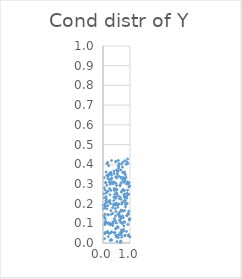
| Category | Series 0 |
|---|---|
| -100.0 | -100 |
| -100.0 | -100 |
| -100.0 | -100 |
| 0.7742711446604577 | 0.107 |
| -100.0 | -100 |
| -100.0 | -100 |
| -100.0 | -100 |
| -100.0 | -100 |
| -100.0 | -100 |
| -100.0 | -100 |
| -100.0 | -100 |
| 0.5765616715410243 | 0.339 |
| -100.0 | -100 |
| -100.0 | -100 |
| -100.0 | -100 |
| -100.0 | -100 |
| -100.0 | -100 |
| -100.0 | -100 |
| -100.0 | -100 |
| -100.0 | -100 |
| -100.0 | -100 |
| 0.25481128692300226 | 0.216 |
| -100.0 | -100 |
| -100.0 | -100 |
| -100.0 | -100 |
| -100.0 | -100 |
| -100.0 | -100 |
| -100.0 | -100 |
| -100.0 | -100 |
| -100.0 | -100 |
| -100.0 | -100 |
| -100.0 | -100 |
| -100.0 | -100 |
| -100.0 | -100 |
| -100.0 | -100 |
| -100.0 | -100 |
| -100.0 | -100 |
| 0.6402166240029006 | 0.052 |
| -100.0 | -100 |
| -100.0 | -100 |
| -100.0 | -100 |
| -100.0 | -100 |
| -100.0 | -100 |
| -100.0 | -100 |
| -100.0 | -100 |
| 0.9499136076958087 | 0.148 |
| -100.0 | -100 |
| -100.0 | -100 |
| -100.0 | -100 |
| -100.0 | -100 |
| -100.0 | -100 |
| -100.0 | -100 |
| -100.0 | -100 |
| -100.0 | -100 |
| -100.0 | -100 |
| 0.7823796118003961 | 0.329 |
| -100.0 | -100 |
| -100.0 | -100 |
| -100.0 | -100 |
| -100.0 | -100 |
| -100.0 | -100 |
| -100.0 | -100 |
| 0.4207167185646359 | 0.124 |
| -100.0 | -100 |
| -100.0 | -100 |
| -100.0 | -100 |
| -100.0 | -100 |
| -100.0 | -100 |
| -100.0 | -100 |
| -100.0 | -100 |
| -100.0 | -100 |
| -100.0 | -100 |
| -100.0 | -100 |
| -100.0 | -100 |
| -100.0 | -100 |
| -100.0 | -100 |
| -100.0 | -100 |
| -100.0 | -100 |
| -100.0 | -100 |
| -100.0 | -100 |
| -100.0 | -100 |
| -100.0 | -100 |
| -100.0 | -100 |
| -100.0 | -100 |
| -100.0 | -100 |
| -100.0 | -100 |
| -100.0 | -100 |
| -100.0 | -100 |
| -100.0 | -100 |
| 0.7235679218305999 | 0.321 |
| -100.0 | -100 |
| 0.5005538349576034 | 0.031 |
| -100.0 | -100 |
| -100.0 | -100 |
| -100.0 | -100 |
| -100.0 | -100 |
| -100.0 | -100 |
| -100.0 | -100 |
| -100.0 | -100 |
| -100.0 | -100 |
| -100.0 | -100 |
| -100.0 | -100 |
| -100.0 | -100 |
| -100.0 | -100 |
| -100.0 | -100 |
| -100.0 | -100 |
| -100.0 | -100 |
| -100.0 | -100 |
| -100.0 | -100 |
| -100.0 | -100 |
| -100.0 | -100 |
| -100.0 | -100 |
| -100.0 | -100 |
| -100.0 | -100 |
| -100.0 | -100 |
| -100.0 | -100 |
| -100.0 | -100 |
| -100.0 | -100 |
| 0.8628502370787773 | 0.399 |
| -100.0 | -100 |
| -100.0 | -100 |
| -100.0 | -100 |
| -100.0 | -100 |
| -100.0 | -100 |
| -100.0 | -100 |
| 0.8003369083146388 | 0.36 |
| 0.4977410522909922 | 0.256 |
| -100.0 | -100 |
| -100.0 | -100 |
| -100.0 | -100 |
| -100.0 | -100 |
| -100.0 | -100 |
| -100.0 | -100 |
| -100.0 | -100 |
| -100.0 | -100 |
| -100.0 | -100 |
| -100.0 | -100 |
| -100.0 | -100 |
| -100.0 | -100 |
| -100.0 | -100 |
| -100.0 | -100 |
| -100.0 | -100 |
| -100.0 | -100 |
| -100.0 | -100 |
| -100.0 | -100 |
| -100.0 | -100 |
| -100.0 | -100 |
| -100.0 | -100 |
| -100.0 | -100 |
| 0.8362634231939766 | 0.198 |
| -100.0 | -100 |
| -100.0 | -100 |
| -100.0 | -100 |
| -100.0 | -100 |
| -100.0 | -100 |
| -100.0 | -100 |
| -100.0 | -100 |
| -100.0 | -100 |
| -100.0 | -100 |
| -100.0 | -100 |
| -100.0 | -100 |
| -100.0 | -100 |
| 0.027762650885497453 | 0.177 |
| -100.0 | -100 |
| -100.0 | -100 |
| -100.0 | -100 |
| -100.0 | -100 |
| -100.0 | -100 |
| -100.0 | -100 |
| -100.0 | -100 |
| -100.0 | -100 |
| -100.0 | -100 |
| -100.0 | -100 |
| -100.0 | -100 |
| -100.0 | -100 |
| -100.0 | -100 |
| -100.0 | -100 |
| -100.0 | -100 |
| -100.0 | -100 |
| -100.0 | -100 |
| -100.0 | -100 |
| -100.0 | -100 |
| -100.0 | -100 |
| -100.0 | -100 |
| -100.0 | -100 |
| -100.0 | -100 |
| -100.0 | -100 |
| -100.0 | -100 |
| -100.0 | -100 |
| -100.0 | -100 |
| -100.0 | -100 |
| -100.0 | -100 |
| -100.0 | -100 |
| -100.0 | -100 |
| -100.0 | -100 |
| -100.0 | -100 |
| -100.0 | -100 |
| -100.0 | -100 |
| -100.0 | -100 |
| -100.0 | -100 |
| -100.0 | -100 |
| -100.0 | -100 |
| -100.0 | -100 |
| -100.0 | -100 |
| -100.0 | -100 |
| -100.0 | -100 |
| -100.0 | -100 |
| -100.0 | -100 |
| -100.0 | -100 |
| -100.0 | -100 |
| -100.0 | -100 |
| -100.0 | -100 |
| -100.0 | -100 |
| -100.0 | -100 |
| -100.0 | -100 |
| -100.0 | -100 |
| -100.0 | -100 |
| -100.0 | -100 |
| -100.0 | -100 |
| -100.0 | -100 |
| -100.0 | -100 |
| -100.0 | -100 |
| -100.0 | -100 |
| -100.0 | -100 |
| -100.0 | -100 |
| -100.0 | -100 |
| 0.1111089341670185 | 0.253 |
| -100.0 | -100 |
| -100.0 | -100 |
| -100.0 | -100 |
| -100.0 | -100 |
| -100.0 | -100 |
| -100.0 | -100 |
| -100.0 | -100 |
| 0.06257710881308665 | 0.177 |
| -100.0 | -100 |
| -100.0 | -100 |
| -100.0 | -100 |
| -100.0 | -100 |
| -100.0 | -100 |
| -100.0 | -100 |
| -100.0 | -100 |
| -100.0 | -100 |
| -100.0 | -100 |
| -100.0 | -100 |
| -100.0 | -100 |
| -100.0 | -100 |
| -100.0 | -100 |
| -100.0 | -100 |
| -100.0 | -100 |
| -100.0 | -100 |
| 0.46705694560583 | 0.137 |
| -100.0 | -100 |
| -100.0 | -100 |
| 0.24112782837990077 | 0.208 |
| -100.0 | -100 |
| -100.0 | -100 |
| -100.0 | -100 |
| -100.0 | -100 |
| 0.498551924813853 | 0.37 |
| -100.0 | -100 |
| -100.0 | -100 |
| -100.0 | -100 |
| -100.0 | -100 |
| -100.0 | -100 |
| -100.0 | -100 |
| -100.0 | -100 |
| 0.27878322207828055 | 0.358 |
| -100.0 | -100 |
| -100.0 | -100 |
| -100.0 | -100 |
| -100.0 | -100 |
| -100.0 | -100 |
| -100.0 | -100 |
| -100.0 | -100 |
| -100.0 | -100 |
| -100.0 | -100 |
| -100.0 | -100 |
| -100.0 | -100 |
| -100.0 | -100 |
| -100.0 | -100 |
| -100.0 | -100 |
| -100.0 | -100 |
| -100.0 | -100 |
| -100.0 | -100 |
| -100.0 | -100 |
| -100.0 | -100 |
| -100.0 | -100 |
| -100.0 | -100 |
| -100.0 | -100 |
| -100.0 | -100 |
| -100.0 | -100 |
| -100.0 | -100 |
| -100.0 | -100 |
| -100.0 | -100 |
| -100.0 | -100 |
| -100.0 | -100 |
| -100.0 | -100 |
| -100.0 | -100 |
| -100.0 | -100 |
| -100.0 | -100 |
| 0.8019658814439082 | 0.249 |
| -100.0 | -100 |
| -100.0 | -100 |
| 0.7419516529665181 | 0.411 |
| -100.0 | -100 |
| -100.0 | -100 |
| -100.0 | -100 |
| -100.0 | -100 |
| -100.0 | -100 |
| -100.0 | -100 |
| -100.0 | -100 |
| -100.0 | -100 |
| 0.6890415489260914 | 0.402 |
| -100.0 | -100 |
| -100.0 | -100 |
| -100.0 | -100 |
| -100.0 | -100 |
| -100.0 | -100 |
| -100.0 | -100 |
| -100.0 | -100 |
| -100.0 | -100 |
| -100.0 | -100 |
| -100.0 | -100 |
| -100.0 | -100 |
| -100.0 | -100 |
| -100.0 | -100 |
| -100.0 | -100 |
| -100.0 | -100 |
| -100.0 | -100 |
| -100.0 | -100 |
| -100.0 | -100 |
| -100.0 | -100 |
| -100.0 | -100 |
| 0.72083535850599 | 0.385 |
| -100.0 | -100 |
| -100.0 | -100 |
| -100.0 | -100 |
| 0.6780203866252439 | 0.005 |
| 0.4769030382822227 | 0.227 |
| -100.0 | -100 |
| -100.0 | -100 |
| -100.0 | -100 |
| -100.0 | -100 |
| -100.0 | -100 |
| -100.0 | -100 |
| -100.0 | -100 |
| -100.0 | -100 |
| -100.0 | -100 |
| -100.0 | -100 |
| -100.0 | -100 |
| -100.0 | -100 |
| 0.6526874871370683 | 0.01 |
| -100.0 | -100 |
| -100.0 | -100 |
| -100.0 | -100 |
| -100.0 | -100 |
| 0.08167801186565937 | 0.125 |
| -100.0 | -100 |
| -100.0 | -100 |
| 0.517344515467056 | 0.25 |
| -100.0 | -100 |
| -100.0 | -100 |
| -100.0 | -100 |
| -100.0 | -100 |
| -100.0 | -100 |
| -100.0 | -100 |
| 0.5331716568098347 | 0.35 |
| -100.0 | -100 |
| 0.5764242668704396 | 0.196 |
| -100.0 | -100 |
| -100.0 | -100 |
| -100.0 | -100 |
| -100.0 | -100 |
| -100.0 | -100 |
| -100.0 | -100 |
| -100.0 | -100 |
| -100.0 | -100 |
| -100.0 | -100 |
| -100.0 | -100 |
| -100.0 | -100 |
| -100.0 | -100 |
| -100.0 | -100 |
| -100.0 | -100 |
| -100.0 | -100 |
| -100.0 | -100 |
| -100.0 | -100 |
| -100.0 | -100 |
| -100.0 | -100 |
| -100.0 | -100 |
| -100.0 | -100 |
| -100.0 | -100 |
| -100.0 | -100 |
| -100.0 | -100 |
| -100.0 | -100 |
| -100.0 | -100 |
| -100.0 | -100 |
| -100.0 | -100 |
| -100.0 | -100 |
| -100.0 | -100 |
| -100.0 | -100 |
| -100.0 | -100 |
| -100.0 | -100 |
| -100.0 | -100 |
| -100.0 | -100 |
| -100.0 | -100 |
| -100.0 | -100 |
| -100.0 | -100 |
| -100.0 | -100 |
| -100.0 | -100 |
| -100.0 | -100 |
| -100.0 | -100 |
| -100.0 | -100 |
| -100.0 | -100 |
| -100.0 | -100 |
| -100.0 | -100 |
| -100.0 | -100 |
| -100.0 | -100 |
| -100.0 | -100 |
| -100.0 | -100 |
| -100.0 | -100 |
| -100.0 | -100 |
| -100.0 | -100 |
| -100.0 | -100 |
| -100.0 | -100 |
| -100.0 | -100 |
| 0.9535630169310554 | 0.247 |
| -100.0 | -100 |
| 0.684705405825054 | 0.162 |
| -100.0 | -100 |
| -100.0 | -100 |
| -100.0 | -100 |
| -100.0 | -100 |
| -100.0 | -100 |
| -100.0 | -100 |
| -100.0 | -100 |
| 0.8933246334468596 | 0.41 |
| 0.08551391417144283 | 0.05 |
| -100.0 | -100 |
| 0.5488298845688195 | 0.083 |
| 0.7778060809231605 | 0.086 |
| -100.0 | -100 |
| -100.0 | -100 |
| -100.0 | -100 |
| -100.0 | -100 |
| -100.0 | -100 |
| -100.0 | -100 |
| -100.0 | -100 |
| -100.0 | -100 |
| -100.0 | -100 |
| -100.0 | -100 |
| -100.0 | -100 |
| -100.0 | -100 |
| -100.0 | -100 |
| 0.308034202022649 | 0.324 |
| -100.0 | -100 |
| -100.0 | -100 |
| -100.0 | -100 |
| -100.0 | -100 |
| -100.0 | -100 |
| 0.4754167720140926 | 0.304 |
| -100.0 | -100 |
| 0.9095466773072595 | 0.268 |
| -100.0 | -100 |
| -100.0 | -100 |
| -100.0 | -100 |
| -100.0 | -100 |
| -100.0 | -100 |
| -100.0 | -100 |
| -100.0 | -100 |
| -100.0 | -100 |
| -100.0 | -100 |
| -100.0 | -100 |
| -100.0 | -100 |
| -100.0 | -100 |
| -100.0 | -100 |
| -100.0 | -100 |
| -100.0 | -100 |
| -100.0 | -100 |
| -100.0 | -100 |
| -100.0 | -100 |
| -100.0 | -100 |
| -100.0 | -100 |
| -100.0 | -100 |
| -100.0 | -100 |
| -100.0 | -100 |
| -100.0 | -100 |
| -100.0 | -100 |
| -100.0 | -100 |
| -100.0 | -100 |
| -100.0 | -100 |
| -100.0 | -100 |
| 0.089533830794858 | 0.307 |
| -100.0 | -100 |
| 0.47062591691854483 | 0.336 |
| -100.0 | -100 |
| -100.0 | -100 |
| -100.0 | -100 |
| -100.0 | -100 |
| -100.0 | -100 |
| 0.6555423441437742 | 0.333 |
| -100.0 | -100 |
| -100.0 | -100 |
| -100.0 | -100 |
| -100.0 | -100 |
| -100.0 | -100 |
| -100.0 | -100 |
| -100.0 | -100 |
| -100.0 | -100 |
| -100.0 | -100 |
| 0.30975811225154015 | 0.146 |
| -100.0 | -100 |
| 0.30737853351495625 | 0.018 |
| -100.0 | -100 |
| -100.0 | -100 |
| -100.0 | -100 |
| -100.0 | -100 |
| -100.0 | -100 |
| -100.0 | -100 |
| -100.0 | -100 |
| -100.0 | -100 |
| -100.0 | -100 |
| -100.0 | -100 |
| -100.0 | -100 |
| -100.0 | -100 |
| -100.0 | -100 |
| -100.0 | -100 |
| -100.0 | -100 |
| -100.0 | -100 |
| -100.0 | -100 |
| -100.0 | -100 |
| -100.0 | -100 |
| -100.0 | -100 |
| -100.0 | -100 |
| -100.0 | -100 |
| -100.0 | -100 |
| -100.0 | -100 |
| 0.5339434823286786 | 0.361 |
| -100.0 | -100 |
| -100.0 | -100 |
| -100.0 | -100 |
| -100.0 | -100 |
| -100.0 | -100 |
| -100.0 | -100 |
| -100.0 | -100 |
| -100.0 | -100 |
| -100.0 | -100 |
| -100.0 | -100 |
| -100.0 | -100 |
| -100.0 | -100 |
| -100.0 | -100 |
| -100.0 | -100 |
| -100.0 | -100 |
| -100.0 | -100 |
| -100.0 | -100 |
| -100.0 | -100 |
| -100.0 | -100 |
| -100.0 | -100 |
| -100.0 | -100 |
| -100.0 | -100 |
| -100.0 | -100 |
| -100.0 | -100 |
| -100.0 | -100 |
| -100.0 | -100 |
| -100.0 | -100 |
| -100.0 | -100 |
| -100.0 | -100 |
| 0.1984204303292736 | 0.052 |
| -100.0 | -100 |
| -100.0 | -100 |
| -100.0 | -100 |
| -100.0 | -100 |
| -100.0 | -100 |
| -100.0 | -100 |
| -100.0 | -100 |
| -100.0 | -100 |
| -100.0 | -100 |
| -100.0 | -100 |
| -100.0 | -100 |
| -100.0 | -100 |
| -100.0 | -100 |
| -100.0 | -100 |
| -100.0 | -100 |
| -100.0 | -100 |
| -100.0 | -100 |
| -100.0 | -100 |
| -100.0 | -100 |
| -100.0 | -100 |
| -100.0 | -100 |
| -100.0 | -100 |
| -100.0 | -100 |
| -100.0 | -100 |
| -100.0 | -100 |
| -100.0 | -100 |
| -100.0 | -100 |
| -100.0 | -100 |
| -100.0 | -100 |
| -100.0 | -100 |
| -100.0 | -100 |
| -100.0 | -100 |
| -100.0 | -100 |
| -100.0 | -100 |
| -100.0 | -100 |
| -100.0 | -100 |
| -100.0 | -100 |
| -100.0 | -100 |
| -100.0 | -100 |
| -100.0 | -100 |
| 0.08569648541643338 | 0.269 |
| -100.0 | -100 |
| -100.0 | -100 |
| -100.0 | -100 |
| -100.0 | -100 |
| -100.0 | -100 |
| -100.0 | -100 |
| -100.0 | -100 |
| -100.0 | -100 |
| -100.0 | -100 |
| -100.0 | -100 |
| 0.6562954140415379 | 0.371 |
| -100.0 | -100 |
| 0.17398781424804666 | 0.144 |
| -100.0 | -100 |
| -100.0 | -100 |
| -100.0 | -100 |
| -100.0 | -100 |
| 0.8300260826397003 | 0.183 |
| -100.0 | -100 |
| -100.0 | -100 |
| -100.0 | -100 |
| -100.0 | -100 |
| -100.0 | -100 |
| -100.0 | -100 |
| -100.0 | -100 |
| -100.0 | -100 |
| -100.0 | -100 |
| 0.7554185559986857 | 0.129 |
| -100.0 | -100 |
| 0.6943121440756159 | 0.056 |
| -100.0 | -100 |
| -100.0 | -100 |
| -100.0 | -100 |
| -100.0 | -100 |
| -100.0 | -100 |
| -100.0 | -100 |
| -100.0 | -100 |
| -100.0 | -100 |
| -100.0 | -100 |
| -100.0 | -100 |
| -100.0 | -100 |
| -100.0 | -100 |
| 0.8285683343654584 | 0.346 |
| -100.0 | -100 |
| -100.0 | -100 |
| -100.0 | -100 |
| -100.0 | -100 |
| -100.0 | -100 |
| -100.0 | -100 |
| -100.0 | -100 |
| 0.14573256096659037 | 0.174 |
| 0.6467031917195959 | 0.134 |
| -100.0 | -100 |
| -100.0 | -100 |
| -100.0 | -100 |
| -100.0 | -100 |
| 0.2599664746139362 | 0.097 |
| -100.0 | -100 |
| 0.5845318653162235 | 0.198 |
| -100.0 | -100 |
| 0.44206693518566353 | 0.27 |
| -100.0 | -100 |
| -100.0 | -100 |
| -100.0 | -100 |
| -100.0 | -100 |
| -100.0 | -100 |
| -100.0 | -100 |
| -100.0 | -100 |
| -100.0 | -100 |
| -100.0 | -100 |
| -100.0 | -100 |
| -100.0 | -100 |
| -100.0 | -100 |
| -100.0 | -100 |
| 0.16949475974429473 | 0.059 |
| -100.0 | -100 |
| -100.0 | -100 |
| -100.0 | -100 |
| -100.0 | -100 |
| -100.0 | -100 |
| -100.0 | -100 |
| -100.0 | -100 |
| 0.5664844714117262 | 0.391 |
| -100.0 | -100 |
| -100.0 | -100 |
| -100.0 | -100 |
| -100.0 | -100 |
| -100.0 | -100 |
| -100.0 | -100 |
| -100.0 | -100 |
| -100.0 | -100 |
| -100.0 | -100 |
| -100.0 | -100 |
| -100.0 | -100 |
| -100.0 | -100 |
| -100.0 | -100 |
| -100.0 | -100 |
| -100.0 | -100 |
| 0.6370889831590686 | 0.118 |
| -100.0 | -100 |
| -100.0 | -100 |
| -100.0 | -100 |
| -100.0 | -100 |
| -100.0 | -100 |
| -100.0 | -100 |
| -100.0 | -100 |
| 0.8550604305154377 | 0.332 |
| -100.0 | -100 |
| -100.0 | -100 |
| -100.0 | -100 |
| -100.0 | -100 |
| -100.0 | -100 |
| -100.0 | -100 |
| -100.0 | -100 |
| -100.0 | -100 |
| 0.09670793272802991 | 0.111 |
| 0.1657986913475904 | 0.055 |
| 0.007930282627428231 | 0.174 |
| -100.0 | -100 |
| -100.0 | -100 |
| -100.0 | -100 |
| -100.0 | -100 |
| -100.0 | -100 |
| -100.0 | -100 |
| -100.0 | -100 |
| -100.0 | -100 |
| -100.0 | -100 |
| -100.0 | -100 |
| -100.0 | -100 |
| -100.0 | -100 |
| -100.0 | -100 |
| -100.0 | -100 |
| -100.0 | -100 |
| -100.0 | -100 |
| -100.0 | -100 |
| -100.0 | -100 |
| -100.0 | -100 |
| -100.0 | -100 |
| -100.0 | -100 |
| -100.0 | -100 |
| 0.2672230127695052 | 0.013 |
| -100.0 | -100 |
| 0.5139085244995907 | 0.27 |
| -100.0 | -100 |
| -100.0 | -100 |
| 0.14104881604114783 | 0.342 |
| -100.0 | -100 |
| -100.0 | -100 |
| -100.0 | -100 |
| -100.0 | -100 |
| -100.0 | -100 |
| -100.0 | -100 |
| -100.0 | -100 |
| -100.0 | -100 |
| -100.0 | -100 |
| -100.0 | -100 |
| -100.0 | -100 |
| -100.0 | -100 |
| -100.0 | -100 |
| -100.0 | -100 |
| -100.0 | -100 |
| -100.0 | -100 |
| -100.0 | -100 |
| -100.0 | -100 |
| -100.0 | -100 |
| -100.0 | -100 |
| 0.8029525652537988 | 0.231 |
| -100.0 | -100 |
| -100.0 | -100 |
| -100.0 | -100 |
| -100.0 | -100 |
| -100.0 | -100 |
| -100.0 | -100 |
| -100.0 | -100 |
| -100.0 | -100 |
| -100.0 | -100 |
| -100.0 | -100 |
| -100.0 | -100 |
| -100.0 | -100 |
| -100.0 | -100 |
| -100.0 | -100 |
| -100.0 | -100 |
| -100.0 | -100 |
| -100.0 | -100 |
| -100.0 | -100 |
| -100.0 | -100 |
| -100.0 | -100 |
| -100.0 | -100 |
| -100.0 | -100 |
| -100.0 | -100 |
| 0.7240243789113191 | 0.266 |
| -100.0 | -100 |
| -100.0 | -100 |
| -100.0 | -100 |
| -100.0 | -100 |
| -100.0 | -100 |
| -100.0 | -100 |
| -100.0 | -100 |
| -100.0 | -100 |
| -100.0 | -100 |
| -100.0 | -100 |
| -100.0 | -100 |
| -100.0 | -100 |
| -100.0 | -100 |
| -100.0 | -100 |
| -100.0 | -100 |
| -100.0 | -100 |
| -100.0 | -100 |
| -100.0 | -100 |
| -100.0 | -100 |
| -100.0 | -100 |
| -100.0 | -100 |
| 0.8931664779406924 | 0.202 |
| -100.0 | -100 |
| -100.0 | -100 |
| -100.0 | -100 |
| 0.4226319734552547 | 0.267 |
| -100.0 | -100 |
| -100.0 | -100 |
| -100.0 | -100 |
| -100.0 | -100 |
| -100.0 | -100 |
| -100.0 | -100 |
| -100.0 | -100 |
| -100.0 | -100 |
| 0.5890968566245721 | 0.392 |
| -100.0 | -100 |
| -100.0 | -100 |
| -100.0 | -100 |
| 0.40349877886880425 | 0.233 |
| -100.0 | -100 |
| 0.5119848367421133 | 0.193 |
| -100.0 | -100 |
| -100.0 | -100 |
| -100.0 | -100 |
| -100.0 | -100 |
| -100.0 | -100 |
| -100.0 | -100 |
| -100.0 | -100 |
| -100.0 | -100 |
| -100.0 | -100 |
| -100.0 | -100 |
| 0.4758310072951525 | 0.413 |
| -100.0 | -100 |
| -100.0 | -100 |
| -100.0 | -100 |
| -100.0 | -100 |
| -100.0 | -100 |
| -100.0 | -100 |
| -100.0 | -100 |
| 0.9641814310178117 | 0.306 |
| -100.0 | -100 |
| -100.0 | -100 |
| -100.0 | -100 |
| -100.0 | -100 |
| -100.0 | -100 |
| -100.0 | -100 |
| -100.0 | -100 |
| -100.0 | -100 |
| -100.0 | -100 |
| -100.0 | -100 |
| -100.0 | -100 |
| -100.0 | -100 |
| -100.0 | -100 |
| -100.0 | -100 |
| -100.0 | -100 |
| -100.0 | -100 |
| -100.0 | -100 |
| -100.0 | -100 |
| -100.0 | -100 |
| -100.0 | -100 |
| -100.0 | -100 |
| -100.0 | -100 |
| -100.0 | -100 |
| -100.0 | -100 |
| -100.0 | -100 |
| 0.3182129702372709 | 0.419 |
| -100.0 | -100 |
| -100.0 | -100 |
| -100.0 | -100 |
| -100.0 | -100 |
| -100.0 | -100 |
| -100.0 | -100 |
| -100.0 | -100 |
| -100.0 | -100 |
| -100.0 | -100 |
| -100.0 | -100 |
| -100.0 | -100 |
| -100.0 | -100 |
| -100.0 | -100 |
| -100.0 | -100 |
| -100.0 | -100 |
| -100.0 | -100 |
| -100.0 | -100 |
| -100.0 | -100 |
| -100.0 | -100 |
| -100.0 | -100 |
| -100.0 | -100 |
| -100.0 | -100 |
| -100.0 | -100 |
| -100.0 | -100 |
| -100.0 | -100 |
| -100.0 | -100 |
| -100.0 | -100 |
| -100.0 | -100 |
| -100.0 | -100 |
| -100.0 | -100 |
| -100.0 | -100 |
| -100.0 | -100 |
| -100.0 | -100 |
| -100.0 | -100 |
| -100.0 | -100 |
| -100.0 | -100 |
| -100.0 | -100 |
| -100.0 | -100 |
| -100.0 | -100 |
| 0.9994210786634932 | 0.122 |
| -100.0 | -100 |
| -100.0 | -100 |
| -100.0 | -100 |
| -100.0 | -100 |
| -100.0 | -100 |
| -100.0 | -100 |
| -100.0 | -100 |
| -100.0 | -100 |
| 0.5029748479624225 | 0.292 |
| -100.0 | -100 |
| -100.0 | -100 |
| -100.0 | -100 |
| -100.0 | -100 |
| -100.0 | -100 |
| -100.0 | -100 |
| -100.0 | -100 |
| -100.0 | -100 |
| 0.8005492520324253 | 0.165 |
| -100.0 | -100 |
| -100.0 | -100 |
| -100.0 | -100 |
| -100.0 | -100 |
| -100.0 | -100 |
| -100.0 | -100 |
| -100.0 | -100 |
| -100.0 | -100 |
| -100.0 | -100 |
| -100.0 | -100 |
| -100.0 | -100 |
| -100.0 | -100 |
| -100.0 | -100 |
| -100.0 | -100 |
| 0.5693132906772275 | 0.419 |
| -100.0 | -100 |
| -100.0 | -100 |
| -100.0 | -100 |
| 0.5796444968137348 | 0.38 |
| -100.0 | -100 |
| -100.0 | -100 |
| -100.0 | -100 |
| -100.0 | -100 |
| -100.0 | -100 |
| -100.0 | -100 |
| -100.0 | -100 |
| -100.0 | -100 |
| 0.46398952641131574 | 0.235 |
| -100.0 | -100 |
| -100.0 | -100 |
| -100.0 | -100 |
| -100.0 | -100 |
| 0.6701473284526568 | 0.306 |
| -100.0 | -100 |
| 0.3273318115524714 | 0.33 |
| -100.0 | -100 |
| -100.0 | -100 |
| -100.0 | -100 |
| -100.0 | -100 |
| -100.0 | -100 |
| -100.0 | -100 |
| -100.0 | -100 |
| 0.49766816298316674 | 0.102 |
| -100.0 | -100 |
| -100.0 | -100 |
| -100.0 | -100 |
| -100.0 | -100 |
| -100.0 | -100 |
| -100.0 | -100 |
| 0.8706895577367435 | 0.059 |
| -100.0 | -100 |
| -100.0 | -100 |
| -100.0 | -100 |
| -100.0 | -100 |
| -100.0 | -100 |
| -100.0 | -100 |
| -100.0 | -100 |
| 0.35556603077306803 | 0.179 |
| -100.0 | -100 |
| -100.0 | -100 |
| -100.0 | -100 |
| -100.0 | -100 |
| 0.696537531496168 | 0.197 |
| 0.912691504016185 | 0.31 |
| -100.0 | -100 |
| -100.0 | -100 |
| -100.0 | -100 |
| 0.6775048680163807 | 0.126 |
| -100.0 | -100 |
| -100.0 | -100 |
| -100.0 | -100 |
| -100.0 | -100 |
| -100.0 | -100 |
| -100.0 | -100 |
| -100.0 | -100 |
| -100.0 | -100 |
| -100.0 | -100 |
| -100.0 | -100 |
| -100.0 | -100 |
| -100.0 | -100 |
| -100.0 | -100 |
| 0.5827134751399488 | 0.041 |
| -100.0 | -100 |
| -100.0 | -100 |
| -100.0 | -100 |
| -100.0 | -100 |
| -100.0 | -100 |
| -100.0 | -100 |
| -100.0 | -100 |
| -100.0 | -100 |
| -100.0 | -100 |
| -100.0 | -100 |
| -100.0 | -100 |
| -100.0 | -100 |
| -100.0 | -100 |
| -100.0 | -100 |
| -100.0 | -100 |
| 0.5411862092596141 | 0.037 |
| -100.0 | -100 |
| -100.0 | -100 |
| -100.0 | -100 |
| -100.0 | -100 |
| -100.0 | -100 |
| -100.0 | -100 |
| -100.0 | -100 |
| -100.0 | -100 |
| -100.0 | -100 |
| -100.0 | -100 |
| -100.0 | -100 |
| -100.0 | -100 |
| -100.0 | -100 |
| -100.0 | -100 |
| -100.0 | -100 |
| -100.0 | -100 |
| -100.0 | -100 |
| -100.0 | -100 |
| -100.0 | -100 |
| -100.0 | -100 |
| -100.0 | -100 |
| -100.0 | -100 |
| 0.550942835068672 | 0.147 |
| -100.0 | -100 |
| -100.0 | -100 |
| -100.0 | -100 |
| -100.0 | -100 |
| 0.2088713894162728 | 0.211 |
| -100.0 | -100 |
| -100.0 | -100 |
| -100.0 | -100 |
| -100.0 | -100 |
| -100.0 | -100 |
| -100.0 | -100 |
| 0.13420862335090522 | 0.101 |
| -100.0 | -100 |
| -100.0 | -100 |
| -100.0 | -100 |
| -100.0 | -100 |
| 0.8203806666564913 | 0.32 |
| -100.0 | -100 |
| -100.0 | -100 |
| -100.0 | -100 |
| -100.0 | -100 |
| -100.0 | -100 |
| -100.0 | -100 |
| -100.0 | -100 |
| -100.0 | -100 |
| -100.0 | -100 |
| 0.25844915836145765 | 0.245 |
| -100.0 | -100 |
| -100.0 | -100 |
| -100.0 | -100 |
| -100.0 | -100 |
| 0.18714892548382212 | 0.263 |
| -100.0 | -100 |
| -100.0 | -100 |
| -100.0 | -100 |
| -100.0 | -100 |
| -100.0 | -100 |
| -100.0 | -100 |
| -100.0 | -100 |
| -100.0 | -100 |
| -100.0 | -100 |
| 0.21563487801215386 | 0.349 |
| -100.0 | -100 |
| -100.0 | -100 |
| -100.0 | -100 |
| -100.0 | -100 |
| -100.0 | -100 |
| -100.0 | -100 |
| -100.0 | -100 |
| -100.0 | -100 |
| -100.0 | -100 |
| -100.0 | -100 |
| -100.0 | -100 |
| -100.0 | -100 |
| -100.0 | -100 |
| -100.0 | -100 |
| -100.0 | -100 |
| -100.0 | -100 |
| -100.0 | -100 |
| -100.0 | -100 |
| -100.0 | -100 |
| -100.0 | -100 |
| -100.0 | -100 |
| -100.0 | -100 |
| -100.0 | -100 |
| -100.0 | -100 |
| -100.0 | -100 |
| -100.0 | -100 |
| -100.0 | -100 |
| -100.0 | -100 |
| -100.0 | -100 |
| -100.0 | -100 |
| -100.0 | -100 |
| -100.0 | -100 |
| -100.0 | -100 |
| -100.0 | -100 |
| -100.0 | -100 |
| -100.0 | -100 |
| 0.26993948590209094 | 0.098 |
| 0.7618991584337045 | 0.06 |
| -100.0 | -100 |
| -100.0 | -100 |
| -100.0 | -100 |
| -100.0 | -100 |
| -100.0 | -100 |
| 0.9587301315633261 | 0.284 |
| -100.0 | -100 |
| -100.0 | -100 |
| -100.0 | -100 |
| -100.0 | -100 |
| -100.0 | -100 |
| -100.0 | -100 |
| -100.0 | -100 |
| -100.0 | -100 |
| -100.0 | -100 |
| -100.0 | -100 |
| -100.0 | -100 |
| 0.467493724668147 | 0.072 |
| -100.0 | -100 |
| -100.0 | -100 |
| -100.0 | -100 |
| -100.0 | -100 |
| 0.969446460712211 | 0.116 |
| -100.0 | -100 |
| -100.0 | -100 |
| -100.0 | -100 |
| 0.11526847408977725 | 0.36 |
| -100.0 | -100 |
| -100.0 | -100 |
| 0.9877129851508489 | 0.29 |
| -100.0 | -100 |
| -100.0 | -100 |
| -100.0 | -100 |
| -100.0 | -100 |
| -100.0 | -100 |
| -100.0 | -100 |
| -100.0 | -100 |
| -100.0 | -100 |
| -100.0 | -100 |
| -100.0 | -100 |
| -100.0 | -100 |
| -100.0 | -100 |
| 0.046749388797773794 | 0.281 |
| -100.0 | -100 |
| 0.4039419380135213 | 0.365 |
| -100.0 | -100 |
| -100.0 | -100 |
| -100.0 | -100 |
| -100.0 | -100 |
| -100.0 | -100 |
| -100.0 | -100 |
| -100.0 | -100 |
| -100.0 | -100 |
| -100.0 | -100 |
| -100.0 | -100 |
| 0.14085990831536443 | 0.293 |
| -100.0 | -100 |
| -100.0 | -100 |
| -100.0 | -100 |
| -100.0 | -100 |
| -100.0 | -100 |
| 0.20206175723129993 | 0.103 |
| -100.0 | -100 |
| -100.0 | -100 |
| -100.0 | -100 |
| -100.0 | -100 |
| -100.0 | -100 |
| -100.0 | -100 |
| 0.05440592672397504 | 0.022 |
| -100.0 | -100 |
| -100.0 | -100 |
| -100.0 | -100 |
| -100.0 | -100 |
| -100.0 | -100 |
| -100.0 | -100 |
| -100.0 | -100 |
| -100.0 | -100 |
| -100.0 | -100 |
| -100.0 | -100 |
| -100.0 | -100 |
| -100.0 | -100 |
| -100.0 | -100 |
| -100.0 | -100 |
| -100.0 | -100 |
| -100.0 | -100 |
| -100.0 | -100 |
| -100.0 | -100 |
| -100.0 | -100 |
| -100.0 | -100 |
| -100.0 | -100 |
| -100.0 | -100 |
| 0.7230774595382462 | 0.098 |
| 0.9434408931603344 | 0.035 |
| -100.0 | -100 |
| -100.0 | -100 |
| -100.0 | -100 |
| -100.0 | -100 |
| -100.0 | -100 |
| -100.0 | -100 |
| 0.6350185872987634 | 0.233 |
| -100.0 | -100 |
| -100.0 | -100 |
| 0.39431896808736244 | 0.199 |
| 0.3649770410148987 | 0.15 |
| -100.0 | -100 |
| -100.0 | -100 |
| -100.0 | -100 |
| -100.0 | -100 |
| -100.0 | -100 |
| -100.0 | -100 |
| -100.0 | -100 |
| -100.0 | -100 |
| -100.0 | -100 |
| -100.0 | -100 |
| -100.0 | -100 |
| 0.698928226436774 | 0.131 |
| -100.0 | -100 |
| -100.0 | -100 |
| -100.0 | -100 |
| -100.0 | -100 |
| -100.0 | -100 |
| -100.0 | -100 |
| -100.0 | -100 |
| 0.9259819615656031 | 0.15 |
| -100.0 | -100 |
| 0.7502881056313554 | 0.272 |
| -100.0 | -100 |
| -100.0 | -100 |
| 0.4096832223129916 | 0.052 |
| -100.0 | -100 |
| -100.0 | -100 |
| -100.0 | -100 |
| -100.0 | -100 |
| -100.0 | -100 |
| -100.0 | -100 |
| -100.0 | -100 |
| -100.0 | -100 |
| -100.0 | -100 |
| -100.0 | -100 |
| -100.0 | -100 |
| 0.7615483013627127 | 0.069 |
| -100.0 | -100 |
| -100.0 | -100 |
| -100.0 | -100 |
| -100.0 | -100 |
| -100.0 | -100 |
| -100.0 | -100 |
| -100.0 | -100 |
| -100.0 | -100 |
| -100.0 | -100 |
| -100.0 | -100 |
| 0.6065004528404868 | 0.225 |
| -100.0 | -100 |
| -100.0 | -100 |
| -100.0 | -100 |
| -100.0 | -100 |
| -100.0 | -100 |
| -100.0 | -100 |
| -100.0 | -100 |
| -100.0 | -100 |
| -100.0 | -100 |
| -100.0 | -100 |
| 0.2737265998555325 | 0.322 |
| -100.0 | -100 |
| -100.0 | -100 |
| -100.0 | -100 |
| -100.0 | -100 |
| -100.0 | -100 |
| -100.0 | -100 |
| -100.0 | -100 |
| -100.0 | -100 |
| -100.0 | -100 |
| -100.0 | -100 |
| -100.0 | -100 |
| -100.0 | -100 |
| 0.7838124738713598 | 0.214 |
| -100.0 | -100 |
| 0.6796315134912658 | 0.04 |
| -100.0 | -100 |
| -100.0 | -100 |
| -100.0 | -100 |
| -100.0 | -100 |
| -100.0 | -100 |
| -100.0 | -100 |
| -100.0 | -100 |
| -100.0 | -100 |
| -100.0 | -100 |
| -100.0 | -100 |
| -100.0 | -100 |
| -100.0 | -100 |
| -100.0 | -100 |
| -100.0 | -100 |
| -100.0 | -100 |
| -100.0 | -100 |
| 0.554503172013452 | 0.239 |
| -100.0 | -100 |
| -100.0 | -100 |
| -100.0 | -100 |
| -100.0 | -100 |
| -100.0 | -100 |
| -100.0 | -100 |
| -100.0 | -100 |
| -100.0 | -100 |
| -100.0 | -100 |
| -100.0 | -100 |
| -100.0 | -100 |
| -100.0 | -100 |
| -100.0 | -100 |
| -100.0 | -100 |
| -100.0 | -100 |
| -100.0 | -100 |
| -100.0 | -100 |
| -100.0 | -100 |
| -100.0 | -100 |
| -100.0 | -100 |
| -100.0 | -100 |
| -100.0 | -100 |
| -100.0 | -100 |
| -100.0 | -100 |
| -100.0 | -100 |
| -100.0 | -100 |
| -100.0 | -100 |
| -100.0 | -100 |
| -100.0 | -100 |
| -100.0 | -100 |
| -100.0 | -100 |
| -100.0 | -100 |
| -100.0 | -100 |
| -100.0 | -100 |
| -100.0 | -100 |
| -100.0 | -100 |
| -100.0 | -100 |
| 0.19956899293610753 | 0.347 |
| 0.3617815593397109 | 0.089 |
| -100.0 | -100 |
| -100.0 | -100 |
| -100.0 | -100 |
| -100.0 | -100 |
| -100.0 | -100 |
| -100.0 | -100 |
| -100.0 | -100 |
| -100.0 | -100 |
| -100.0 | -100 |
| -100.0 | -100 |
| -100.0 | -100 |
| -100.0 | -100 |
| -100.0 | -100 |
| -100.0 | -100 |
| -100.0 | -100 |
| -100.0 | -100 |
| -100.0 | -100 |
| -100.0 | -100 |
| -100.0 | -100 |
| -100.0 | -100 |
| -100.0 | -100 |
| -100.0 | -100 |
| -100.0 | -100 |
| -100.0 | -100 |
| -100.0 | -100 |
| -100.0 | -100 |
| 0.7279029713801729 | 0.137 |
| -100.0 | -100 |
| -100.0 | -100 |
| 0.7680651983653896 | 0.331 |
| 0.7421117783096659 | 0.162 |
| -100.0 | -100 |
| -100.0 | -100 |
| -100.0 | -100 |
| -100.0 | -100 |
| -100.0 | -100 |
| -100.0 | -100 |
| -100.0 | -100 |
| 0.2913830507578794 | 0.052 |
| -100.0 | -100 |
| -100.0 | -100 |
| -100.0 | -100 |
| -100.0 | -100 |
| -100.0 | -100 |
| -100.0 | -100 |
| -100.0 | -100 |
| 0.9177056801765351 | 0.404 |
| -100.0 | -100 |
| -100.0 | -100 |
| -100.0 | -100 |
| -100.0 | -100 |
| -100.0 | -100 |
| -100.0 | -100 |
| -100.0 | -100 |
| -100.0 | -100 |
| -100.0 | -100 |
| -100.0 | -100 |
| -100.0 | -100 |
| -100.0 | -100 |
| 0.9225263941981423 | 0.308 |
| -100.0 | -100 |
| -100.0 | -100 |
| -100.0 | -100 |
| -100.0 | -100 |
| -100.0 | -100 |
| -100.0 | -100 |
| -100.0 | -100 |
| -100.0 | -100 |
| -100.0 | -100 |
| -100.0 | -100 |
| -100.0 | -100 |
| -100.0 | -100 |
| -100.0 | -100 |
| -100.0 | -100 |
| -100.0 | -100 |
| -100.0 | -100 |
| -100.0 | -100 |
| -100.0 | -100 |
| -100.0 | -100 |
| 0.5068975125179149 | 0.032 |
| -100.0 | -100 |
| -100.0 | -100 |
| 0.9133873371045867 | 0.426 |
| -100.0 | -100 |
| -100.0 | -100 |
| -100.0 | -100 |
| -100.0 | -100 |
| -100.0 | -100 |
| -100.0 | -100 |
| -100.0 | -100 |
| -100.0 | -100 |
| -100.0 | -100 |
| -100.0 | -100 |
| -100.0 | -100 |
| -100.0 | -100 |
| -100.0 | -100 |
| -100.0 | -100 |
| -100.0 | -100 |
| -100.0 | -100 |
| -100.0 | -100 |
| -100.0 | -100 |
| -100.0 | -100 |
| 0.8030144448070383 | 0.211 |
| -100.0 | -100 |
| -100.0 | -100 |
| -100.0 | -100 |
| -100.0 | -100 |
| -100.0 | -100 |
| -100.0 | -100 |
| -100.0 | -100 |
| -100.0 | -100 |
| -100.0 | -100 |
| -100.0 | -100 |
| -100.0 | -100 |
| -100.0 | -100 |
| -100.0 | -100 |
| -100.0 | -100 |
| -100.0 | -100 |
| -100.0 | -100 |
| -100.0 | -100 |
| 0.6951930217010553 | 0.263 |
| -100.0 | -100 |
| -100.0 | -100 |
| 0.5692531410120477 | 0.027 |
| 0.9577304637997699 | 0.162 |
| -100.0 | -100 |
| -100.0 | -100 |
| -100.0 | -100 |
| -100.0 | -100 |
| -100.0 | -100 |
| -100.0 | -100 |
| -100.0 | -100 |
| -100.0 | -100 |
| -100.0 | -100 |
| -100.0 | -100 |
| 0.6921034643952652 | 0.029 |
| -100.0 | -100 |
| -100.0 | -100 |
| -100.0 | -100 |
| -100.0 | -100 |
| -100.0 | -100 |
| -100.0 | -100 |
| -100.0 | -100 |
| -100.0 | -100 |
| -100.0 | -100 |
| -100.0 | -100 |
| -100.0 | -100 |
| -100.0 | -100 |
| -100.0 | -100 |
| 0.603737214007285 | 0.134 |
| -100.0 | -100 |
| -100.0 | -100 |
| 0.6666681127912669 | 0.166 |
| -100.0 | -100 |
| -100.0 | -100 |
| -100.0 | -100 |
| -100.0 | -100 |
| -100.0 | -100 |
| -100.0 | -100 |
| -100.0 | -100 |
| 0.47889267704932903 | 0.275 |
| 0.59366865018425 | 0.403 |
| -100.0 | -100 |
| -100.0 | -100 |
| -100.0 | -100 |
| -100.0 | -100 |
| -100.0 | -100 |
| -100.0 | -100 |
| -100.0 | -100 |
| -100.0 | -100 |
| 0.46899609634508055 | 0.039 |
| 0.4393976564091131 | 0.114 |
| -100.0 | -100 |
| -100.0 | -100 |
| -100.0 | -100 |
| -100.0 | -100 |
| -100.0 | -100 |
| -100.0 | -100 |
| -100.0 | -100 |
| -100.0 | -100 |
| 0.7608366372141345 | 0.308 |
| -100.0 | -100 |
| -100.0 | -100 |
| -100.0 | -100 |
| 0.23361771884545468 | 0.311 |
| -100.0 | -100 |
| -100.0 | -100 |
| -100.0 | -100 |
| -100.0 | -100 |
| -100.0 | -100 |
| 0.2926608648405721 | 0.164 |
| -100.0 | -100 |
| -100.0 | -100 |
| -100.0 | -100 |
| -100.0 | -100 |
| -100.0 | -100 |
| -100.0 | -100 |
| -100.0 | -100 |
| -100.0 | -100 |
| -100.0 | -100 |
| -100.0 | -100 |
| -100.0 | -100 |
| -100.0 | -100 |
| -100.0 | -100 |
| -100.0 | -100 |
| -100.0 | -100 |
| -100.0 | -100 |
| -100.0 | -100 |
| -100.0 | -100 |
| -100.0 | -100 |
| -100.0 | -100 |
| -100.0 | -100 |
| 0.29362935494735654 | 0.267 |
| -100.0 | -100 |
| -100.0 | -100 |
| -100.0 | -100 |
| -100.0 | -100 |
| -100.0 | -100 |
| -100.0 | -100 |
| -100.0 | -100 |
| -100.0 | -100 |
| -100.0 | -100 |
| -100.0 | -100 |
| -100.0 | -100 |
| -100.0 | -100 |
| -100.0 | -100 |
| -100.0 | -100 |
| 0.05458557221056348 | 0.194 |
| -100.0 | -100 |
| -100.0 | -100 |
| -100.0 | -100 |
| -100.0 | -100 |
| -100.0 | -100 |
| -100.0 | -100 |
| -100.0 | -100 |
| -100.0 | -100 |
| -100.0 | -100 |
| -100.0 | -100 |
| -100.0 | -100 |
| -100.0 | -100 |
| -100.0 | -100 |
| 0.697937839003803 | 0.167 |
| -100.0 | -100 |
| -100.0 | -100 |
| 0.9154752869840209 | 0.3 |
| -100.0 | -100 |
| -100.0 | -100 |
| -100.0 | -100 |
| -100.0 | -100 |
| -100.0 | -100 |
| -100.0 | -100 |
| -100.0 | -100 |
| -100.0 | -100 |
| -100.0 | -100 |
| -100.0 | -100 |
| -100.0 | -100 |
| -100.0 | -100 |
| -100.0 | -100 |
| 0.47596432441650194 | 0.16 |
| -100.0 | -100 |
| -100.0 | -100 |
| -100.0 | -100 |
| -100.0 | -100 |
| -100.0 | -100 |
| -100.0 | -100 |
| -100.0 | -100 |
| 0.3986008841159939 | 0.215 |
| -100.0 | -100 |
| -100.0 | -100 |
| -100.0 | -100 |
| -100.0 | -100 |
| -100.0 | -100 |
| -100.0 | -100 |
| -100.0 | -100 |
| -100.0 | -100 |
| -100.0 | -100 |
| -100.0 | -100 |
| -100.0 | -100 |
| -100.0 | -100 |
| -100.0 | -100 |
| -100.0 | -100 |
| -100.0 | -100 |
| -100.0 | -100 |
| -100.0 | -100 |
| -100.0 | -100 |
| -100.0 | -100 |
| -100.0 | -100 |
| -100.0 | -100 |
| -100.0 | -100 |
| -100.0 | -100 |
| -100.0 | -100 |
| -100.0 | -100 |
| -100.0 | -100 |
| -100.0 | -100 |
| -100.0 | -100 |
| -100.0 | -100 |
| 0.8726420956864815 | 0.198 |
| -100.0 | -100 |
| -100.0 | -100 |
| -100.0 | -100 |
| 0.8271462026107042 | 0.234 |
| -100.0 | -100 |
| -100.0 | -100 |
| -100.0 | -100 |
| -100.0 | -100 |
| -100.0 | -100 |
| -100.0 | -100 |
| -100.0 | -100 |
| -100.0 | -100 |
| -100.0 | -100 |
| -100.0 | -100 |
| -100.0 | -100 |
| -100.0 | -100 |
| -100.0 | -100 |
| -100.0 | -100 |
| -100.0 | -100 |
| -100.0 | -100 |
| -100.0 | -100 |
| -100.0 | -100 |
| -100.0 | -100 |
| -100.0 | -100 |
| -100.0 | -100 |
| -100.0 | -100 |
| -100.0 | -100 |
| -100.0 | -100 |
| -100.0 | -100 |
| -100.0 | -100 |
| -100.0 | -100 |
| -100.0 | -100 |
| -100.0 | -100 |
| -100.0 | -100 |
| -100.0 | -100 |
| -100.0 | -100 |
| -100.0 | -100 |
| -100.0 | -100 |
| -100.0 | -100 |
| -100.0 | -100 |
| -100.0 | -100 |
| -100.0 | -100 |
| -100.0 | -100 |
| -100.0 | -100 |
| -100.0 | -100 |
| -100.0 | -100 |
| -100.0 | -100 |
| 0.285606504891171 | 0.358 |
| 0.3206012466982797 | 0.057 |
| -100.0 | -100 |
| -100.0 | -100 |
| 0.8927274756528021 | 0.139 |
| -100.0 | -100 |
| -100.0 | -100 |
| -100.0 | -100 |
| 0.0008963442615343986 | 0.192 |
| 0.1064382721931385 | 0.215 |
| -100.0 | -100 |
| -100.0 | -100 |
| -100.0 | -100 |
| -100.0 | -100 |
| -100.0 | -100 |
| -100.0 | -100 |
| -100.0 | -100 |
| -100.0 | -100 |
| -100.0 | -100 |
| -100.0 | -100 |
| 0.1061476977826904 | 0.307 |
| -100.0 | -100 |
| -100.0 | -100 |
| -100.0 | -100 |
| -100.0 | -100 |
| -100.0 | -100 |
| -100.0 | -100 |
| -100.0 | -100 |
| -100.0 | -100 |
| -100.0 | -100 |
| -100.0 | -100 |
| -100.0 | -100 |
| -100.0 | -100 |
| 0.5698113900702841 | 0.145 |
| -100.0 | -100 |
| -100.0 | -100 |
| -100.0 | -100 |
| -100.0 | -100 |
| 0.16971388662282705 | 0.409 |
| 0.3447079858171018 | 0.309 |
| -100.0 | -100 |
| -100.0 | -100 |
| -100.0 | -100 |
| -100.0 | -100 |
| -100.0 | -100 |
| -100.0 | -100 |
| -100.0 | -100 |
| -100.0 | -100 |
| -100.0 | -100 |
| -100.0 | -100 |
| -100.0 | -100 |
| 0.2676837342696313 | 0.298 |
| -100.0 | -100 |
| -100.0 | -100 |
| -100.0 | -100 |
| -100.0 | -100 |
| 0.627426334228482 | 0.29 |
| 0.6070154984927525 | 0.155 |
| -100.0 | -100 |
| -100.0 | -100 |
| -100.0 | -100 |
| 0.4094537884569458 | 0.276 |
| -100.0 | -100 |
| -100.0 | -100 |
| 0.6797945827143698 | 0.13 |
| -100.0 | -100 |
| -100.0 | -100 |
| -100.0 | -100 |
| -100.0 | -100 |
| -100.0 | -100 |
| 0.3179180942483698 | 0.345 |
| -100.0 | -100 |
| -100.0 | -100 |
| -100.0 | -100 |
| -100.0 | -100 |
| -100.0 | -100 |
| -100.0 | -100 |
| -100.0 | -100 |
| -100.0 | -100 |
| -100.0 | -100 |
| -100.0 | -100 |
| -100.0 | -100 |
| 0.2400525952431376 | 0.277 |
| -100.0 | -100 |
| -100.0 | -100 |
| 0.5199476935241075 | 0.007 |
| -100.0 | -100 |
| -100.0 | -100 |
| -100.0 | -100 |
| -100.0 | -100 |
| -100.0 | -100 |
| -100.0 | -100 |
| -100.0 | -100 |
| -100.0 | -100 |
| -100.0 | -100 |
| -100.0 | -100 |
| -100.0 | -100 |
| -100.0 | -100 |
| -100.0 | -100 |
| -100.0 | -100 |
| -100.0 | -100 |
| -100.0 | -100 |
| -100.0 | -100 |
| -100.0 | -100 |
| -100.0 | -100 |
| -100.0 | -100 |
| -100.0 | -100 |
| -100.0 | -100 |
| -100.0 | -100 |
| -100.0 | -100 |
| -100.0 | -100 |
| -100.0 | -100 |
| -100.0 | -100 |
| -100.0 | -100 |
| -100.0 | -100 |
| 0.8087897323055995 | 0.107 |
| -100.0 | -100 |
| -100.0 | -100 |
| -100.0 | -100 |
| -100.0 | -100 |
| -100.0 | -100 |
| -100.0 | -100 |
| -100.0 | -100 |
| -100.0 | -100 |
| -100.0 | -100 |
| -100.0 | -100 |
| -100.0 | -100 |
| -100.0 | -100 |
| -100.0 | -100 |
| -100.0 | -100 |
| -100.0 | -100 |
| -100.0 | -100 |
| -100.0 | -100 |
| -100.0 | -100 |
| -100.0 | -100 |
| -100.0 | -100 |
| -100.0 | -100 |
| -100.0 | -100 |
| -100.0 | -100 |
| -100.0 | -100 |
| -100.0 | -100 |
| -100.0 | -100 |
| -100.0 | -100 |
| -100.0 | -100 |
| -100.0 | -100 |
| -100.0 | -100 |
| -100.0 | -100 |
| -100.0 | -100 |
| -100.0 | -100 |
| -100.0 | -100 |
| -100.0 | -100 |
| -100.0 | -100 |
| -100.0 | -100 |
| -100.0 | -100 |
| -100.0 | -100 |
| -100.0 | -100 |
| -100.0 | -100 |
| 0.9485921303034315 | 0.042 |
| -100.0 | -100 |
| -100.0 | -100 |
| -100.0 | -100 |
| -100.0 | -100 |
| -100.0 | -100 |
| -100.0 | -100 |
| -100.0 | -100 |
| -100.0 | -100 |
| -100.0 | -100 |
| -100.0 | -100 |
| -100.0 | -100 |
| -100.0 | -100 |
| -100.0 | -100 |
| -100.0 | -100 |
| -100.0 | -100 |
| -100.0 | -100 |
| -100.0 | -100 |
| -100.0 | -100 |
| 0.7360022427374501 | 0.331 |
| 0.453887665649515 | 0.112 |
| -100.0 | -100 |
| -100.0 | -100 |
| -100.0 | -100 |
| 0.3159062174591192 | 0.014 |
| -100.0 | -100 |
| 0.364603714249217 | 0.107 |
| -100.0 | -100 |
| -100.0 | -100 |
| -100.0 | -100 |
| -100.0 | -100 |
| -100.0 | -100 |
| -100.0 | -100 |
| -100.0 | -100 |
| 0.603698582664664 | 0.144 |
| -100.0 | -100 |
| -100.0 | -100 |
| -100.0 | -100 |
| -100.0 | -100 |
| -100.0 | -100 |
| -100.0 | -100 |
| -100.0 | -100 |
| -100.0 | -100 |
| -100.0 | -100 |
| -100.0 | -100 |
| -100.0 | -100 |
| 0.5121770706554923 | 0.33 |
| -100.0 | -100 |
| -100.0 | -100 |
| -100.0 | -100 |
| -100.0 | -100 |
| -100.0 | -100 |
| -100.0 | -100 |
| -100.0 | -100 |
| -100.0 | -100 |
| -100.0 | -100 |
| -100.0 | -100 |
| -100.0 | -100 |
| -100.0 | -100 |
| -100.0 | -100 |
| -100.0 | -100 |
| -100.0 | -100 |
| 0.211687450225586 | 0.392 |
| -100.0 | -100 |
| -100.0 | -100 |
| -100.0 | -100 |
| -100.0 | -100 |
| -100.0 | -100 |
| -100.0 | -100 |
| -100.0 | -100 |
| -100.0 | -100 |
| -100.0 | -100 |
| -100.0 | -100 |
| -100.0 | -100 |
| -100.0 | -100 |
| -100.0 | -100 |
| -100.0 | -100 |
| -100.0 | -100 |
| -100.0 | -100 |
| -100.0 | -100 |
| -100.0 | -100 |
| -100.0 | -100 |
| -100.0 | -100 |
| -100.0 | -100 |
| -100.0 | -100 |
| -100.0 | -100 |
| -100.0 | -100 |
| -100.0 | -100 |
| -100.0 | -100 |
| 0.3732184195062377 | 0.101 |
| -100.0 | -100 |
| -100.0 | -100 |
| -100.0 | -100 |
| -100.0 | -100 |
| -100.0 | -100 |
| -100.0 | -100 |
| -100.0 | -100 |
| -100.0 | -100 |
| -100.0 | -100 |
| -100.0 | -100 |
| -100.0 | -100 |
| -100.0 | -100 |
| -100.0 | -100 |
| -100.0 | -100 |
| -100.0 | -100 |
| -100.0 | -100 |
| -100.0 | -100 |
| -100.0 | -100 |
| -100.0 | -100 |
| -100.0 | -100 |
| -100.0 | -100 |
| -100.0 | -100 |
| -100.0 | -100 |
| -100.0 | -100 |
| 0.8214513187179817 | 0.04 |
| -100.0 | -100 |
| -100.0 | -100 |
| -100.0 | -100 |
| -100.0 | -100 |
| -100.0 | -100 |
| -100.0 | -100 |
| -100.0 | -100 |
| -100.0 | -100 |
| -100.0 | -100 |
| -100.0 | -100 |
| -100.0 | -100 |
| -100.0 | -100 |
| 0.06480143585447429 | 0.094 |
| -100.0 | -100 |
| -100.0 | -100 |
| -100.0 | -100 |
| -100.0 | -100 |
| -100.0 | -100 |
| -100.0 | -100 |
| -100.0 | -100 |
| 0.19348400702674073 | 0.328 |
| -100.0 | -100 |
| -100.0 | -100 |
| -100.0 | -100 |
| -100.0 | -100 |
| -100.0 | -100 |
| 0.20491185510658605 | 0.142 |
| -100.0 | -100 |
| -100.0 | -100 |
| -100.0 | -100 |
| -100.0 | -100 |
| -100.0 | -100 |
| -100.0 | -100 |
| -100.0 | -100 |
| -100.0 | -100 |
| -100.0 | -100 |
| -100.0 | -100 |
| -100.0 | -100 |
| -100.0 | -100 |
| -100.0 | -100 |
| -100.0 | -100 |
| -100.0 | -100 |
| -100.0 | -100 |
| -100.0 | -100 |
| -100.0 | -100 |
| -100.0 | -100 |
| -100.0 | -100 |
| -100.0 | -100 |
| -100.0 | -100 |
| -100.0 | -100 |
| -100.0 | -100 |
| -100.0 | -100 |
| -100.0 | -100 |
| -100.0 | -100 |
| -100.0 | -100 |
| -100.0 | -100 |
| -100.0 | -100 |
| -100.0 | -100 |
| -100.0 | -100 |
| -100.0 | -100 |
| -100.0 | -100 |
| -100.0 | -100 |
| -100.0 | -100 |
| -100.0 | -100 |
| -100.0 | -100 |
| -100.0 | -100 |
| -100.0 | -100 |
| -100.0 | -100 |
| -100.0 | -100 |
| -100.0 | -100 |
| -100.0 | -100 |
| -100.0 | -100 |
| -100.0 | -100 |
| -100.0 | -100 |
| -100.0 | -100 |
| -100.0 | -100 |
| -100.0 | -100 |
| -100.0 | -100 |
| -100.0 | -100 |
| -100.0 | -100 |
| -100.0 | -100 |
| -100.0 | -100 |
| -100.0 | -100 |
| -100.0 | -100 |
| -100.0 | -100 |
| -100.0 | -100 |
| -100.0 | -100 |
| -100.0 | -100 |
| -100.0 | -100 |
| -100.0 | -100 |
| -100.0 | -100 |
| -100.0 | -100 |
| -100.0 | -100 |
| -100.0 | -100 |
| -100.0 | -100 |
| 0.02598155712181871 | 0.138 |
| -100.0 | -100 |
| -100.0 | -100 |
| -100.0 | -100 |
| -100.0 | -100 |
| -100.0 | -100 |
| -100.0 | -100 |
| -100.0 | -100 |
| -100.0 | -100 |
| -100.0 | -100 |
| -100.0 | -100 |
| 0.9992445651664865 | 0.031 |
| -100.0 | -100 |
| -100.0 | -100 |
| -100.0 | -100 |
| -100.0 | -100 |
| -100.0 | -100 |
| -100.0 | -100 |
| -100.0 | -100 |
| -100.0 | -100 |
| -100.0 | -100 |
| -100.0 | -100 |
| -100.0 | -100 |
| 0.7868697213801404 | 0.234 |
| -100.0 | -100 |
| -100.0 | -100 |
| -100.0 | -100 |
| -100.0 | -100 |
| -100.0 | -100 |
| -100.0 | -100 |
| -100.0 | -100 |
| -100.0 | -100 |
| -100.0 | -100 |
| -100.0 | -100 |
| -100.0 | -100 |
| -100.0 | -100 |
| -100.0 | -100 |
| -100.0 | -100 |
| -100.0 | -100 |
| -100.0 | -100 |
| -100.0 | -100 |
| -100.0 | -100 |
| -100.0 | -100 |
| -100.0 | -100 |
| -100.0 | -100 |
| -100.0 | -100 |
| -100.0 | -100 |
| -100.0 | -100 |
| 0.843452976445961 | 0.195 |
| -100.0 | -100 |
| -100.0 | -100 |
| -100.0 | -100 |
| -100.0 | -100 |
| -100.0 | -100 |
| 0.09785415507717765 | 0.202 |
| -100.0 | -100 |
| -100.0 | -100 |
| -100.0 | -100 |
| 0.18841693394032755 | 0.326 |
| -100.0 | -100 |
| 0.8765706488739085 | 0.139 |
| -100.0 | -100 |
| -100.0 | -100 |
| -100.0 | -100 |
| -100.0 | -100 |
| -100.0 | -100 |
| 0.09814154014927468 | 0.188 |
| -100.0 | -100 |
| -100.0 | -100 |
| -100.0 | -100 |
| -100.0 | -100 |
| -100.0 | -100 |
| -100.0 | -100 |
| 0.8695067563624027 | 0.3 |
| -100.0 | -100 |
| -100.0 | -100 |
| -100.0 | -100 |
| -100.0 | -100 |
| -100.0 | -100 |
| -100.0 | -100 |
| -100.0 | -100 |
| -100.0 | -100 |
| -100.0 | -100 |
| 0.04449435838293103 | 0.332 |
| -100.0 | -100 |
| -100.0 | -100 |
| -100.0 | -100 |
| -100.0 | -100 |
| -100.0 | -100 |
| -100.0 | -100 |
| 0.8971436920770935 | 0.24 |
| -100.0 | -100 |
| -100.0 | -100 |
| 0.4294723838228893 | 0.23 |
| 0.20217161446786802 | 0.342 |
| -100.0 | -100 |
| -100.0 | -100 |
| -100.0 | -100 |
| -100.0 | -100 |
| -100.0 | -100 |
| -100.0 | -100 |
| -100.0 | -100 |
| 0.7322524601315156 | 0.359 |
| -100.0 | -100 |
| -100.0 | -100 |
| -100.0 | -100 |
| -100.0 | -100 |
| -100.0 | -100 |
| -100.0 | -100 |
| -100.0 | -100 |
| -100.0 | -100 |
| -100.0 | -100 |
| -100.0 | -100 |
| -100.0 | -100 |
| -100.0 | -100 |
| -100.0 | -100 |
| -100.0 | -100 |
| -100.0 | -100 |
| -100.0 | -100 |
| -100.0 | -100 |
| -100.0 | -100 |
| -100.0 | -100 |
| -100.0 | -100 |
| -100.0 | -100 |
| -100.0 | -100 |
| -100.0 | -100 |
| -100.0 | -100 |
| -100.0 | -100 |
| -100.0 | -100 |
| -100.0 | -100 |
| -100.0 | -100 |
| -100.0 | -100 |
| -100.0 | -100 |
| -100.0 | -100 |
| -100.0 | -100 |
| -100.0 | -100 |
| -100.0 | -100 |
| -100.0 | -100 |
| -100.0 | -100 |
| -100.0 | -100 |
| -100.0 | -100 |
| -100.0 | -100 |
| -100.0 | -100 |
| -100.0 | -100 |
| -100.0 | -100 |
| -100.0 | -100 |
| -100.0 | -100 |
| -100.0 | -100 |
| -100.0 | -100 |
| 0.48634242050229737 | 0.076 |
| -100.0 | -100 |
| -100.0 | -100 |
| -100.0 | -100 |
| -100.0 | -100 |
| -100.0 | -100 |
| -100.0 | -100 |
| -100.0 | -100 |
| -100.0 | -100 |
| -100.0 | -100 |
| -100.0 | -100 |
| -100.0 | -100 |
| -100.0 | -100 |
| -100.0 | -100 |
| -100.0 | -100 |
| -100.0 | -100 |
| 0.087604557624961 | 0.054 |
| -100.0 | -100 |
| -100.0 | -100 |
| -100.0 | -100 |
| -100.0 | -100 |
| -100.0 | -100 |
| -100.0 | -100 |
| -100.0 | -100 |
| -100.0 | -100 |
| -100.0 | -100 |
| -100.0 | -100 |
| -100.0 | -100 |
| -100.0 | -100 |
| -100.0 | -100 |
| -100.0 | -100 |
| 0.6383471475101423 | 0.295 |
| 0.37224753671543687 | 0.3 |
| -100.0 | -100 |
| -100.0 | -100 |
| -100.0 | -100 |
| -100.0 | -100 |
| -100.0 | -100 |
| -100.0 | -100 |
| -100.0 | -100 |
| -100.0 | -100 |
| -100.0 | -100 |
| -100.0 | -100 |
| -100.0 | -100 |
| -100.0 | -100 |
| -100.0 | -100 |
| -100.0 | -100 |
| -100.0 | -100 |
| -100.0 | -100 |
| -100.0 | -100 |
| 0.7731665592140003 | 0.244 |
| -100.0 | -100 |
| -100.0 | -100 |
| -100.0 | -100 |
| -100.0 | -100 |
| -100.0 | -100 |
| 0.12914741586254563 | 0.224 |
| -100.0 | -100 |
| -100.0 | -100 |
| -100.0 | -100 |
| 0.1476105106956238 | 0.402 |
| -100.0 | -100 |
| -100.0 | -100 |
| 0.04592227275753369 | 0.133 |
| -100.0 | -100 |
| -100.0 | -100 |
| -100.0 | -100 |
| -100.0 | -100 |
| 0.6722012987667874 | 0.222 |
| 0.5596599740090324 | 0.077 |
| -100.0 | -100 |
| -100.0 | -100 |
| -100.0 | -100 |
| -100.0 | -100 |
| -100.0 | -100 |
| -100.0 | -100 |
| -100.0 | -100 |
| 0.2315249042987575 | 0.047 |
| -100.0 | -100 |
| -100.0 | -100 |
| -100.0 | -100 |
| -100.0 | -100 |
| -100.0 | -100 |
| 0.5511082108072771 | 0.182 |
| -100.0 | -100 |
| -100.0 | -100 |
| -100.0 | -100 |
| -100.0 | -100 |
| -100.0 | -100 |
| -100.0 | -100 |
| -100.0 | -100 |
| -100.0 | -100 |
| -100.0 | -100 |
| -100.0 | -100 |
| -100.0 | -100 |
| -100.0 | -100 |
| -100.0 | -100 |
| -100.0 | -100 |
| -100.0 | -100 |
| -100.0 | -100 |
| -100.0 | -100 |
| -100.0 | -100 |
| -100.0 | -100 |
| -100.0 | -100 |
| -100.0 | -100 |
| -100.0 | -100 |
| -100.0 | -100 |
| -100.0 | -100 |
| -100.0 | -100 |
| -100.0 | -100 |
| -100.0 | -100 |
| -100.0 | -100 |
| -100.0 | -100 |
| -100.0 | -100 |
| 0.969545263716233 | 0.123 |
| -100.0 | -100 |
| -100.0 | -100 |
| -100.0 | -100 |
| -100.0 | -100 |
| -100.0 | -100 |
| -100.0 | -100 |
| -100.0 | -100 |
| -100.0 | -100 |
| -100.0 | -100 |
| -100.0 | -100 |
| -100.0 | -100 |
| -100.0 | -100 |
| -100.0 | -100 |
| -100.0 | -100 |
| -100.0 | -100 |
| -100.0 | -100 |
| -100.0 | -100 |
| -100.0 | -100 |
| -100.0 | -100 |
| -100.0 | -100 |
| -100.0 | -100 |
| -100.0 | -100 |
| -100.0 | -100 |
| -100.0 | -100 |
| -100.0 | -100 |
| -100.0 | -100 |
| -100.0 | -100 |
| -100.0 | -100 |
| -100.0 | -100 |
| -100.0 | -100 |
| -100.0 | -100 |
| -100.0 | -100 |
| -100.0 | -100 |
| -100.0 | -100 |
| -100.0 | -100 |
| 0.06675599425781564 | 0.048 |
| -100.0 | -100 |
| -100.0 | -100 |
| -100.0 | -100 |
| -100.0 | -100 |
| 0.9230327969191899 | 0.094 |
| -100.0 | -100 |
| -100.0 | -100 |
| -100.0 | -100 |
| -100.0 | -100 |
| 0.4087534243594987 | 0.353 |
| -100.0 | -100 |
| 0.27731867309775615 | 0.2 |
| -100.0 | -100 |
| -100.0 | -100 |
| 0.3945271316784652 | 0.191 |
| -100.0 | -100 |
| -100.0 | -100 |
| -100.0 | -100 |
| -100.0 | -100 |
| -100.0 | -100 |
| -100.0 | -100 |
| -100.0 | -100 |
| -100.0 | -100 |
| -100.0 | -100 |
| -100.0 | -100 |
| -100.0 | -100 |
| -100.0 | -100 |
| -100.0 | -100 |
| -100.0 | -100 |
| -100.0 | -100 |
| -100.0 | -100 |
| -100.0 | -100 |
| -100.0 | -100 |
| -100.0 | -100 |
| -100.0 | -100 |
| -100.0 | -100 |
| -100.0 | -100 |
| -100.0 | -100 |
| -100.0 | -100 |
| 0.13222341342475263 | 0.207 |
| -100.0 | -100 |
| -100.0 | -100 |
| 0.4717531097612201 | 0.414 |
| -100.0 | -100 |
| -100.0 | -100 |
| -100.0 | -100 |
| -100.0 | -100 |
| -100.0 | -100 |
| -100.0 | -100 |
| 0.6645224700939337 | 0.055 |
| -100.0 | -100 |
| 0.2677001556320797 | 0.352 |
| -100.0 | -100 |
| -100.0 | -100 |
| -100.0 | -100 |
| -100.0 | -100 |
| -100.0 | -100 |
| -100.0 | -100 |
| -100.0 | -100 |
| -100.0 | -100 |
| 0.3264530099777395 | 0.094 |
| -100.0 | -100 |
| -100.0 | -100 |
| -100.0 | -100 |
| -100.0 | -100 |
| -100.0 | -100 |
| -100.0 | -100 |
| -100.0 | -100 |
| -100.0 | -100 |
| -100.0 | -100 |
| -100.0 | -100 |
| -100.0 | -100 |
| -100.0 | -100 |
| -100.0 | -100 |
| -100.0 | -100 |
| -100.0 | -100 |
| -100.0 | -100 |
| -100.0 | -100 |
| -100.0 | -100 |
| -100.0 | -100 |
| 0.676571456559049 | 0.049 |
| -100.0 | -100 |
| 0.8860988198222779 | 0.228 |
| -100.0 | -100 |
| -100.0 | -100 |
| -100.0 | -100 |
| -100.0 | -100 |
| -100.0 | -100 |
| -100.0 | -100 |
| -100.0 | -100 |
| -100.0 | -100 |
| -100.0 | -100 |
| -100.0 | -100 |
| -100.0 | -100 |
| -100.0 | -100 |
| 0.67730194841435 | 0.258 |
| -100.0 | -100 |
| -100.0 | -100 |
| -100.0 | -100 |
| -100.0 | -100 |
| -100.0 | -100 |
| -100.0 | -100 |
| -100.0 | -100 |
| -100.0 | -100 |
| -100.0 | -100 |
| -100.0 | -100 |
| -100.0 | -100 |
| -100.0 | -100 |
| -100.0 | -100 |
| -100.0 | -100 |
| -100.0 | -100 |
| 0.7958096968427333 | 0.267 |
| -100.0 | -100 |
| -100.0 | -100 |
| -100.0 | -100 |
| -100.0 | -100 |
| -100.0 | -100 |
| -100.0 | -100 |
| -100.0 | -100 |
| -100.0 | -100 |
| -100.0 | -100 |
| -100.0 | -100 |
| -100.0 | -100 |
| -100.0 | -100 |
| -100.0 | -100 |
| -100.0 | -100 |
| -100.0 | -100 |
| 0.27343689241451363 | 0.303 |
| -100.0 | -100 |
| -100.0 | -100 |
| -100.0 | -100 |
| -100.0 | -100 |
| -100.0 | -100 |
| -100.0 | -100 |
| -100.0 | -100 |
| -100.0 | -100 |
| -100.0 | -100 |
| -100.0 | -100 |
| -100.0 | -100 |
| 0.637704622123603 | 0.002 |
| -100.0 | -100 |
| -100.0 | -100 |
| -100.0 | -100 |
| -100.0 | -100 |
| -100.0 | -100 |
| -100.0 | -100 |
| -100.0 | -100 |
| -100.0 | -100 |
| -100.0 | -100 |
| 0.8052879005559195 | 0.312 |
| -100.0 | -100 |
| 0.19467335057847668 | 0.032 |
| -100.0 | -100 |
| -100.0 | -100 |
| -100.0 | -100 |
| 0.6878350293427054 | 0.066 |
| -100.0 | -100 |
| 0.8920506543000114 | 0.253 |
| -100.0 | -100 |
| -100.0 | -100 |
| -100.0 | -100 |
| -100.0 | -100 |
| -100.0 | -100 |
| -100.0 | -100 |
| -100.0 | -100 |
| -100.0 | -100 |
| 0.48622946772089115 | 0.203 |
| -100.0 | -100 |
| -100.0 | -100 |
| -100.0 | -100 |
| -100.0 | -100 |
| -100.0 | -100 |
| -100.0 | -100 |
| -100.0 | -100 |
| -100.0 | -100 |
| -100.0 | -100 |
| -100.0 | -100 |
| -100.0 | -100 |
| -100.0 | -100 |
| -100.0 | -100 |
| -100.0 | -100 |
| -100.0 | -100 |
| -100.0 | -100 |
| -100.0 | -100 |
| -100.0 | -100 |
| -100.0 | -100 |
| -100.0 | -100 |
| -100.0 | -100 |
| -100.0 | -100 |
| 0.28421194394519533 | 0.092 |
| -100.0 | -100 |
| -100.0 | -100 |
| -100.0 | -100 |
| -100.0 | -100 |
| -100.0 | -100 |
| -100.0 | -100 |
| -100.0 | -100 |
| -100.0 | -100 |
| -100.0 | -100 |
| -100.0 | -100 |
| -100.0 | -100 |
| -100.0 | -100 |
| -100.0 | -100 |
| -100.0 | -100 |
| -100.0 | -100 |
| -100.0 | -100 |
| -100.0 | -100 |
| -100.0 | -100 |
| -100.0 | -100 |
| -100.0 | -100 |
| -100.0 | -100 |
| -100.0 | -100 |
| -100.0 | -100 |
| -100.0 | -100 |
| -100.0 | -100 |
| -100.0 | -100 |
| -100.0 | -100 |
| -100.0 | -100 |
| -100.0 | -100 |
| -100.0 | -100 |
| -100.0 | -100 |
| -100.0 | -100 |
| -100.0 | -100 |
| -100.0 | -100 |
| -100.0 | -100 |
| -100.0 | -100 |
| -100.0 | -100 |
| -100.0 | -100 |
| -100.0 | -100 |
| -100.0 | -100 |
| -100.0 | -100 |
| -100.0 | -100 |
| -100.0 | -100 |
| 0.7071303863186404 | 0.206 |
| -100.0 | -100 |
| -100.0 | -100 |
| -100.0 | -100 |
| -100.0 | -100 |
| -100.0 | -100 |
| 0.6606456900466372 | 0.333 |
| -100.0 | -100 |
| 0.44943884828086333 | 0.053 |
| -100.0 | -100 |
| -100.0 | -100 |
| -100.0 | -100 |
| 0.03697700933195913 | 0.23 |
| -100.0 | -100 |
| -100.0 | -100 |
| -100.0 | -100 |
| -100.0 | -100 |
| -100.0 | -100 |
| -100.0 | -100 |
| 0.821432453981769 | 0.418 |
| -100.0 | -100 |
| -100.0 | -100 |
| 0.1777541141089749 | 0.189 |
| -100.0 | -100 |
| 0.608833869010365 | 0.115 |
| -100.0 | -100 |
| -100.0 | -100 |
| -100.0 | -100 |
| -100.0 | -100 |
| -100.0 | -100 |
| -100.0 | -100 |
| -100.0 | -100 |
| -100.0 | -100 |
| -100.0 | -100 |
| -100.0 | -100 |
| -100.0 | -100 |
| 0.4299961488024918 | 0.248 |
| -100.0 | -100 |
| -100.0 | -100 |
| -100.0 | -100 |
| -100.0 | -100 |
| -100.0 | -100 |
| -100.0 | -100 |
| -100.0 | -100 |
| -100.0 | -100 |
| -100.0 | -100 |
| -100.0 | -100 |
| -100.0 | -100 |
| -100.0 | -100 |
| -100.0 | -100 |
| -100.0 | -100 |
| -100.0 | -100 |
| -100.0 | -100 |
| 0.828392292039756 | 0.217 |
| -100.0 | -100 |
| -100.0 | -100 |
| -100.0 | -100 |
| 0.4568025647134609 | 0.175 |
| -100.0 | -100 |
| -100.0 | -100 |
| -100.0 | -100 |
| -100.0 | -100 |
| -100.0 | -100 |
| -100.0 | -100 |
| -100.0 | -100 |
| -100.0 | -100 |
| 0.4099963630149336 | 0.309 |
| -100.0 | -100 |
| -100.0 | -100 |
| -100.0 | -100 |
| -100.0 | -100 |
| -100.0 | -100 |
| -100.0 | -100 |
| -100.0 | -100 |
| -100.0 | -100 |
| -100.0 | -100 |
| 0.22368721955708504 | 0.095 |
| -100.0 | -100 |
| -100.0 | -100 |
| 0.11755256057458885 | 0.235 |
| -100.0 | -100 |
| -100.0 | -100 |
| -100.0 | -100 |
| -100.0 | -100 |
| 0.6435104460464866 | 0.108 |
| -100.0 | -100 |
| -100.0 | -100 |
| -100.0 | -100 |
| -100.0 | -100 |
| -100.0 | -100 |
| -100.0 | -100 |
| -100.0 | -100 |
| -100.0 | -100 |
| -100.0 | -100 |
| -100.0 | -100 |
| -100.0 | -100 |
| -100.0 | -100 |
| -100.0 | -100 |
| -100.0 | -100 |
| -100.0 | -100 |
| -100.0 | -100 |
| 0.7776195216256067 | 0.354 |
| -100.0 | -100 |
| -100.0 | -100 |
| -100.0 | -100 |
| -100.0 | -100 |
| -100.0 | -100 |
| -100.0 | -100 |
| -100.0 | -100 |
| -100.0 | -100 |
| 0.5687538969854882 | 0.367 |
| -100.0 | -100 |
| -100.0 | -100 |
| -100.0 | -100 |
| -100.0 | -100 |
| 0.022361200477733045 | 0.25 |
| -100.0 | -100 |
| 0.1684787999381182 | 0.342 |
| -100.0 | -100 |
| -100.0 | -100 |
| -100.0 | -100 |
| -100.0 | -100 |
| -100.0 | -100 |
| -100.0 | -100 |
| -100.0 | -100 |
| -100.0 | -100 |
| -100.0 | -100 |
| -100.0 | -100 |
| -100.0 | -100 |
| -100.0 | -100 |
| -100.0 | -100 |
| -100.0 | -100 |
| -100.0 | -100 |
| -100.0 | -100 |
| -100.0 | -100 |
| 0.8058825564465433 | 0.036 |
| 0.08065079191894342 | 0.103 |
| -100.0 | -100 |
| -100.0 | -100 |
| -100.0 | -100 |
| -100.0 | -100 |
| -100.0 | -100 |
| -100.0 | -100 |
| -100.0 | -100 |
| -100.0 | -100 |
| -100.0 | -100 |
| -100.0 | -100 |
| -100.0 | -100 |
| -100.0 | -100 |
| -100.0 | -100 |
| -100.0 | -100 |
| -100.0 | -100 |
| -100.0 | -100 |
| -100.0 | -100 |
| -100.0 | -100 |
| -100.0 | -100 |
| -100.0 | -100 |
| -100.0 | -100 |
| -100.0 | -100 |
| -100.0 | -100 |
| 0.0752950512543199 | 0.189 |
| -100.0 | -100 |
| -100.0 | -100 |
| -100.0 | -100 |
| -100.0 | -100 |
| -100.0 | -100 |
| -100.0 | -100 |
| -100.0 | -100 |
| -100.0 | -100 |
| -100.0 | -100 |
| -100.0 | -100 |
| -100.0 | -100 |
| -100.0 | -100 |
| -100.0 | -100 |
| -100.0 | -100 |
| 0.677821681981728 | 0.103 |
| -100.0 | -100 |
| -100.0 | -100 |
| -100.0 | -100 |
| -100.0 | -100 |
| -100.0 | -100 |
| -100.0 | -100 |
| 0.08048850936318996 | 0.146 |
| 0.46548044601009186 | 0.193 |
| -100.0 | -100 |
| -100.0 | -100 |
| -100.0 | -100 |
| -100.0 | -100 |
| -100.0 | -100 |
| -100.0 | -100 |
| -100.0 | -100 |
| 0.16753083987516593 | 0.261 |
| -100.0 | -100 |
| -100.0 | -100 |
| -100.0 | -100 |
| -100.0 | -100 |
| -100.0 | -100 |
| -100.0 | -100 |
| -100.0 | -100 |
| -100.0 | -100 |